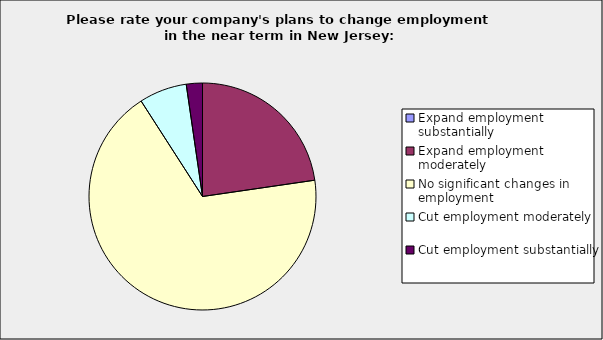
| Category | Series 0 |
|---|---|
| Expand employment substantially | 0 |
| Expand employment moderately | 0.227 |
| No significant changes in employment | 0.682 |
| Cut employment moderately | 0.068 |
| Cut employment substantially | 0.023 |